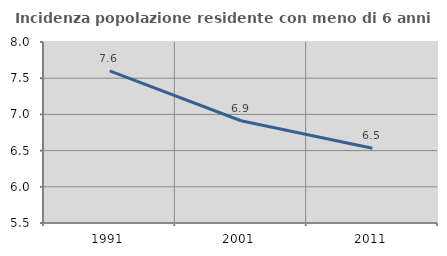
| Category | Incidenza popolazione residente con meno di 6 anni |
|---|---|
| 1991.0 | 7.601 |
| 2001.0 | 6.912 |
| 2011.0 | 6.532 |